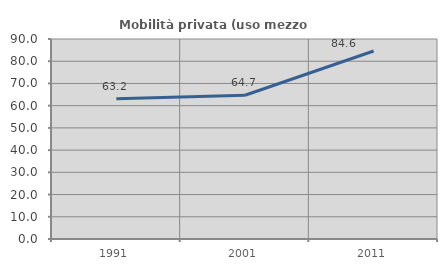
| Category | Mobilità privata (uso mezzo privato) |
|---|---|
| 1991.0 | 63.158 |
| 2001.0 | 64.706 |
| 2011.0 | 84.615 |